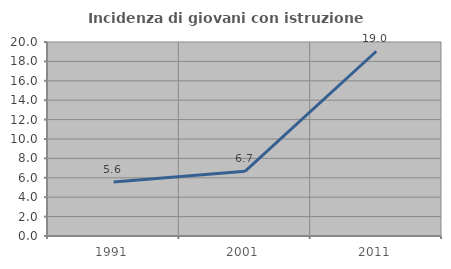
| Category | Incidenza di giovani con istruzione universitaria |
|---|---|
| 1991.0 | 5.556 |
| 2001.0 | 6.667 |
| 2011.0 | 19.048 |